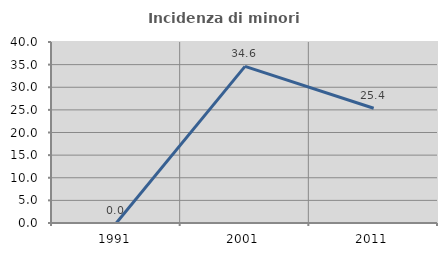
| Category | Incidenza di minori stranieri |
|---|---|
| 1991.0 | 0 |
| 2001.0 | 34.615 |
| 2011.0 | 25.352 |